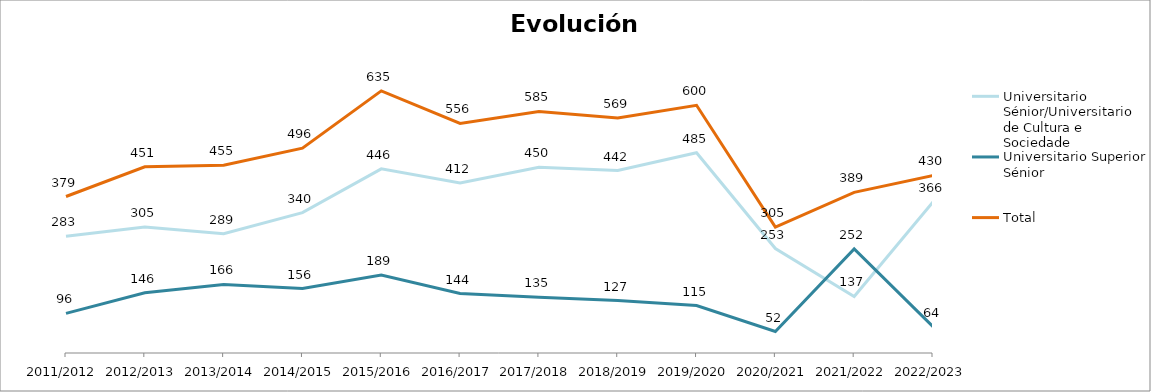
| Category | Universitario Sénior/Universitario de Cultura e Sociedade | Universitario Superior Sénior | Total |
|---|---|---|---|
| 2011/2012 | 283 | 96 | 379 |
| 2012/2013 | 305 | 146 | 451 |
| 2013/2014 | 289 | 166 | 455 |
| 2014/2015 | 340 | 156 | 496 |
| 2015/2016 | 446 | 189 | 635 |
| 2016/2017 | 412 | 144 | 556 |
| 2017/2018 | 450 | 135 | 585 |
| 2018/2019 | 442 | 127 | 569 |
| 2019/2020 | 485 | 115 | 600 |
| 2020/2021 | 253 | 52 | 305 |
| 2021/2022 | 137 | 252 | 389 |
| 2022/2023 | 366 | 64 | 430 |